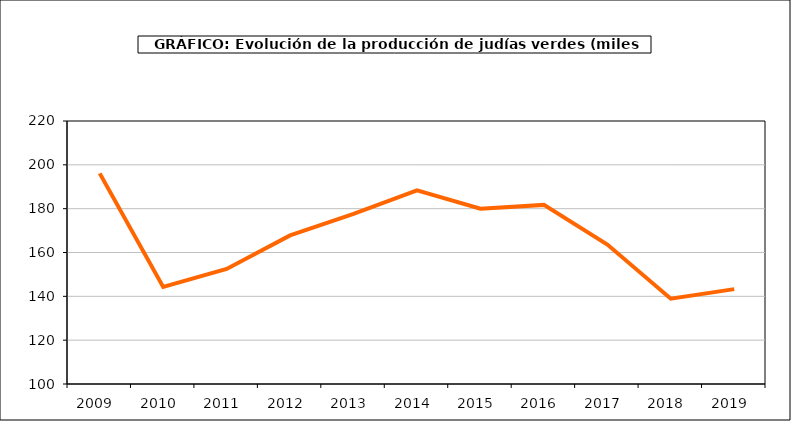
| Category | producción |
|---|---|
| 2009.0 | 196.109 |
| 2010.0 | 144.301 |
| 2011.0 | 152.507 |
| 2012.0 | 167.816 |
| 2013.0 | 177.588 |
| 2014.0 | 188.38 |
| 2015.0 | 179.947 |
| 2016.0 | 181.725 |
| 2017.0 | 163.649 |
| 2018.0 | 138.925 |
| 2019.0 | 143.289 |